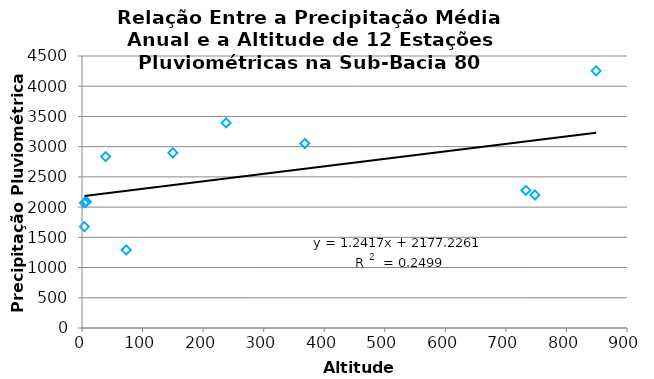
| Category | Series 0 |
|---|---|
| 238.0 | 3392.7 |
| 733.0 | 2277.6 |
| 368.0 | 3053.1 |
| 150.0 | 2896.9 |
| 849.0 | 4254.4 |
| 7.0 | 2090.7 |
| 748.0 | 2201.2 |
| 4.0 | 1677.7 |
| 39.0 | 2836.1 |
| 6.0 | 2080.9 |
| 4.0 | 2070.9 |
| 73.0 | 1291.6 |